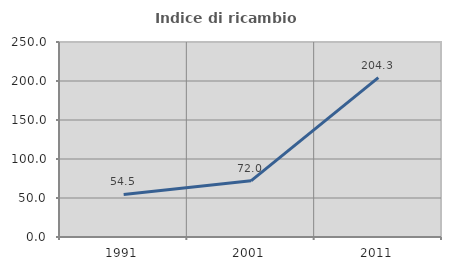
| Category | Indice di ricambio occupazionale  |
|---|---|
| 1991.0 | 54.545 |
| 2001.0 | 71.97 |
| 2011.0 | 204.348 |